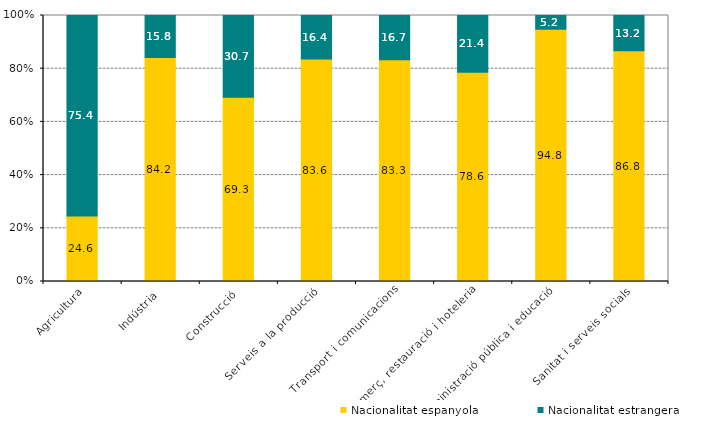
| Category | Nacionalitat espanyola | Nacionalitat estrangera |
|---|---|---|
| Agricultura | 24.625 | 75.375 |
| Indústria | 84.2 | 15.8 |
| Construcció | 69.31 | 30.69 |
| Serveis a la producció | 83.623 | 16.377 |
| Transport i comunicacions | 83.333 | 16.667 |
| Comerç, restauració i hoteleria | 78.649 | 21.351 |
| Administració pública i educació | 94.848 | 5.152 |
| Sanitat i serveis socials | 86.769 | 13.231 |